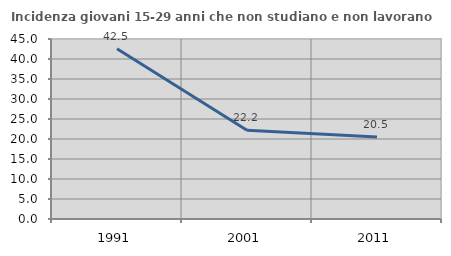
| Category | Incidenza giovani 15-29 anni che non studiano e non lavorano  |
|---|---|
| 1991.0 | 42.545 |
| 2001.0 | 22.177 |
| 2011.0 | 20.502 |